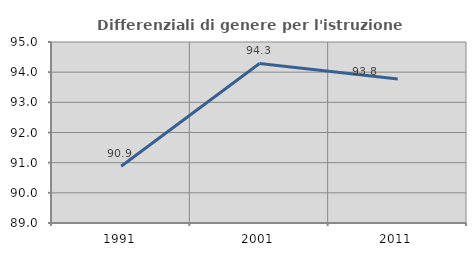
| Category | Differenziali di genere per l'istruzione superiore |
|---|---|
| 1991.0 | 90.883 |
| 2001.0 | 94.289 |
| 2011.0 | 93.777 |